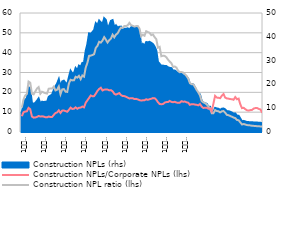
| Category | Construction NPL ratio (lhs) | Construction NPLs/Corporate NPLs (lhs) |
|---|---|---|
|  | 12.298 | 7.953 |
|  | 16.411 | 9.964 |
|  | 18.367 | 10.307 |
|  | 19.169 | 10.429 |
| 6
2009 | 25.433 | 12.171 |
|  | 24.835 | 11.492 |
|  | 19.256 | 7.802 |
|  | 18.981 | 7.244 |
|  | 20.435 | 7.307 |
|  | 21.895 | 7.598 |
| 12 | 22.645 | 8.082 |
| 1
2010 | 19.291 | 7.791 |
|  | 20.325 | 7.901 |
|  | 19.909 | 7.77 |
|  | 19.587 | 7.459 |
|  | 19.384 | 7.403 |
| 6
2010 | 21.841 | 7.803 |
|  | 21.9 | 7.569 |
|  | 21.893 | 7.585 |
|  | 22.897 | 8.602 |
|  | 20.957 | 9.578 |
|  | 21.316 | 9.883 |
| 12 | 22.951 | 10.902 |
| 1
2011 | 19.044 | 9.605 |
|  | 21.464 | 10.773 |
|  | 21.647 | 10.817 |
|  | 20.33 | 10.537 |
|  | 20.222 | 10.213 |
| 6
2011 | 24.486 | 11.167 |
|  | 26.307 | 12.286 |
|  | 26.025 | 11.63 |
|  | 26.069 | 11.734 |
|  | 27.804 | 12.439 |
|  | 27.388 | 11.715 |
| 12 | 28.322 | 12.235 |
| 1
2012 | 26.666 | 12.303 |
|  | 28.495 | 12.822 |
|  | 27.903 | 12.414 |
|  | 32.444 | 14.729 |
|  | 34.841 | 15.967 |
| 6
2012 | 38.393 | 17.166 |
|  | 38.504 | 18.425 |
|  | 38.824 | 18.02 |
|  | 39.218 | 18.083 |
|  | 42.401 | 19.329 |
|  | 43.421 | 20.716 |
| 12 | 45.464 | 21.691 |
| 1
2013 | 45.077 | 22.315 |
|  | 46.093 | 20.946 |
|  | 47.827 | 21.339 |
|  | 46.562 | 21.484 |
|  | 45.129 | 21.378 |
| 6
2013 | 46.309 | 20.985 |
|  | 47.078 | 21.124 |
|  | 49.061 | 20.535 |
|  | 47.719 | 19.305 |
|  | 49.11 | 18.858 |
|  | 49.753 | 19.235 |
| 12 | 51.351 | 19.613 |
| 1
2014 | 52.672 | 18.623 |
|  | 52.459 | 18.13 |
|  | 53.449 | 18.092 |
|  | 53.4 | 17.773 |
|  | 53.814 | 17.325 |
| 6
2014 | 55.031 | 16.909 |
|  | 53.856 | 17.062 |
|  | 53.532 | 17.007 |
|  | 53.153 | 16.589 |
|  | 53.392 | 16.713 |
|  | 53.438 | 16.409 |
| 12 | 52.2 | 16.064 |
| 1
2015 | 48.26 | 15.867 |
|  | 48.994 | 15.97 |
|  | 48.54 | 16.023 |
|  | 50.819 | 16.5 |
|  | 50.398 | 16.224 |
| 6
2015 | 50.034 | 16.529 |
|  | 48.852 | 16.755 |
|  | 49.2 | 17.08 |
|  | 47.851 | 17.074 |
|  | 46.8 | 16.302 |
|  | 42.497 | 15.02 |
| 12 | 42.897 | 14.115 |
| 1
2016 | 38.217 | 14.005 |
|  | 38.481 | 14.086 |
|  | 38.357 | 14.828 |
|  | 37.683 | 15.073 |
|  | 36.469 | 15.098 |
| 6
2016 | 35.485 | 15.671 |
|  | 34.686 | 15.189 |
|  | 32.812 | 15.006 |
|  | 33.031 | 15.257 |
|  | 32.472 | 14.824 |
|  | 30.854 | 14.772 |
| 12 | 30.237 | 14.756 |
| 1
2017 | 30.25 | 15.536 |
|  | 30.017 | 15.275 |
|  | 29.166 | 15.356 |
|  | 28.279 | 14.979 |
|  | 26.947 | 14.796 |
| 6
2017 | 24.631 | 13.709 |
|  | 24.106 | 14.046 |
|  | 24.082 | 14.052 |
|  | 22.783 | 13.837 |
|  | 21.226 | 13.72 |
|  | 19.97 | 13.447 |
| 12 | 18.452 | 14.114 |
| 1
2018 | 15.625 | 12.822 |
|  | 14.94 | 12.128 |
|  | 14.54 | 12.227 |
|  | 13.92 | 12.239 |
|  | 12.85 | 11.727 |
| 6
2018 | 11.9 | 11.834 |
|  | 9.5 | 10.392 |
|  | 9.47 | 14.361 |
|  | 11.06 | 18.232 |
|  | 10.59 | 17.345 |
|  | 10.44 | 17.269 |
| 12 | 9.88 | 17.028 |
| 1
2019 | 10.41 | 18.313 |
|  | 10.579 | 19.133 |
|  | 9.755 | 17.365 |
|  | 8.609 | 16.93 |
|  | 8.463 | 16.813 |
| 6
2019 | 8.06 | 16.583 |
|  | 7.693 | 16.56 |
|  | 7.264 | 16.26 |
|  | 7.001 | 17.614 |
|  | 6.068 | 16.511 |
|  | 5.909 | 16.838 |
| 12 | 4.879 | 13.922 |
| 1
2020 | 3.783 | 12.044 |
|  | 4.026 | 12.199 |
|  | 3.781 | 11.477 |
|  | 3.49 | 10.947 |
|  | 3.39 | 10.794 |
| 6
2020 | 3.325 | 11.042 |
|  | 3.14 | 11.152 |
|  | 3.091 | 11.832 |
|  | 3.018 | 12.084 |
|  | 2.917 | 12.046 |
|  | 2.859 | 11.635 |
| 12 | 2.814 | 11.33 |